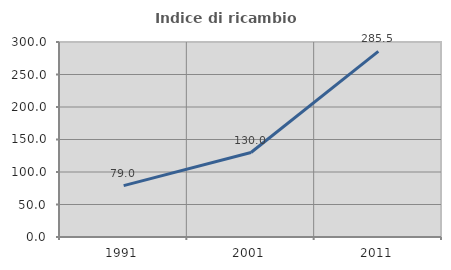
| Category | Indice di ricambio occupazionale  |
|---|---|
| 1991.0 | 79.012 |
| 2001.0 | 130 |
| 2011.0 | 285.507 |